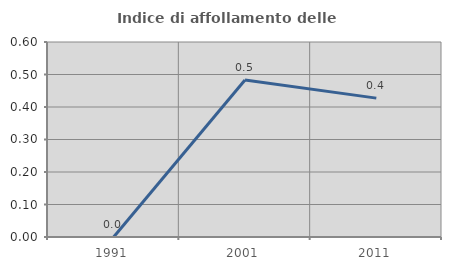
| Category | Indice di affollamento delle abitazioni  |
|---|---|
| 1991.0 | 0 |
| 2001.0 | 0.483 |
| 2011.0 | 0.427 |